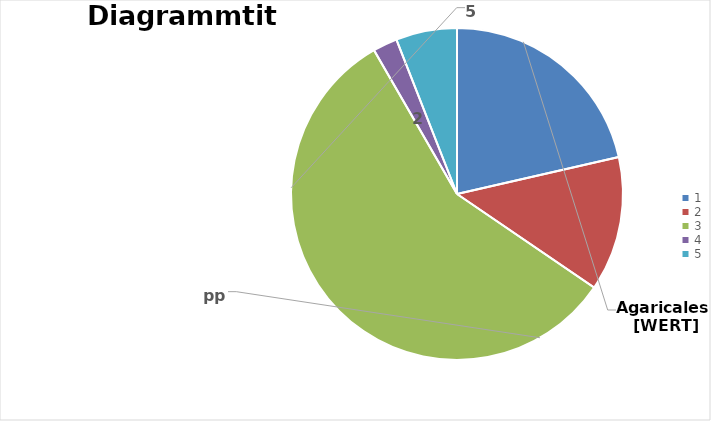
| Category | Series 0 |
|---|---|
| 0 | 18 |
| 1 | 11 |
| 2 | 48 |
| 3 | 2 |
| 4 | 5 |